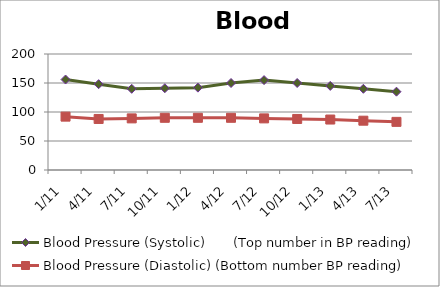
| Category | Blood Pressure (Systolic)       (Top number in BP reading) | Blood Pressure (Diastolic) (Bottom number BP reading) |
|---|---|---|
| 1/11 | 156 | 92 |
| 4/11 | 148 | 88 |
| 7/11 | 140 | 89 |
| 10/11 | 141 | 90 |
| 1/12 | 142 | 90 |
| 4/12 | 150 | 90 |
| 7/12 | 155 | 89 |
| 10/12 | 150 | 88 |
| 1/13 | 145 | 87 |
| 4/13 | 140 | 85 |
| 7/13 | 135 | 83 |